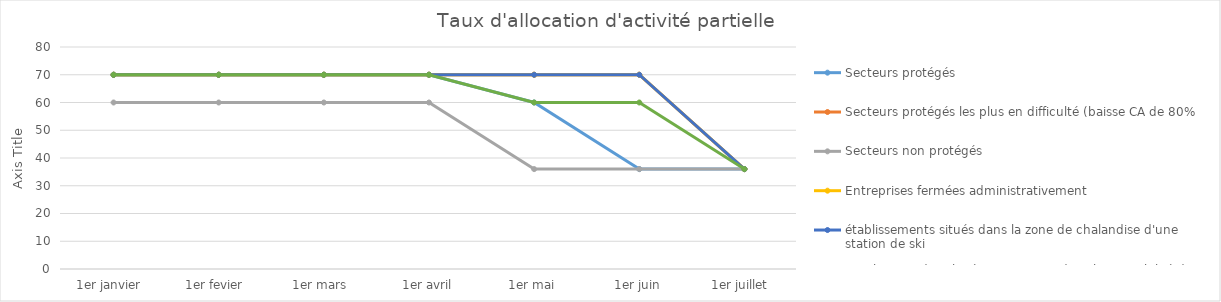
| Category | Secteurs protégés  | Secteurs protégés les plus en difficulté (baisse CA de 80% | Secteurs non protégés  | Entreprises fermées administrativement | établissements situés dans la zone de chalandise d'une station de ski | Employeurs de salariés se trouvant dans l'impossibilité de continuer à travailler (garde d'enfants et personnes vulnerables)  |
|---|---|---|---|---|---|---|
| 1er janvier  | 70 | 70 | 60 | 70 | 70 | 70 |
| 1er fevier  | 70 | 70 | 60 | 70 | 70 | 70 |
| 1er mars  | 70 | 70 | 60 | 70 | 70 | 70 |
| 1er avril | 70 | 70 | 60 | 70 | 70 | 70 |
| 1er mai | 60 | 70 | 36 | 70 | 70 | 60 |
| 1er juin | 36 | 70 | 36 | 70 | 70 | 60 |
| 1er juillet  | 36 | 36 | 36 | 36 | 36 | 36 |